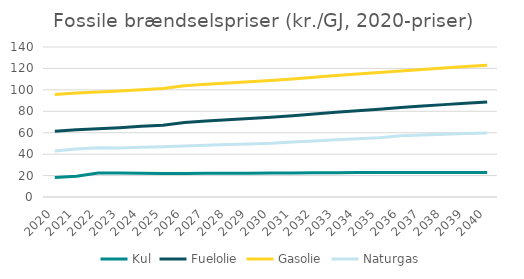
| Category | Kul | Fuelolie | Gasolie | Naturgas |
|---|---|---|---|---|
| 2020.0 | 18.234 | 61.315 | 95.565 | 43.001 |
| 2021.0 | 19.397 | 62.73 | 96.98 | 44.762 |
| 2022.0 | 22.372 | 63.641 | 97.891 | 45.987 |
| 2023.0 | 22.361 | 64.729 | 98.979 | 45.744 |
| 2024.0 | 22.127 | 65.955 | 100.205 | 46.349 |
| 2025.0 | 21.853 | 66.935 | 101.186 | 46.904 |
| 2026.0 | 21.973 | 69.586 | 103.836 | 47.589 |
| 2027.0 | 22.08 | 70.9 | 105.15 | 48.247 |
| 2028.0 | 22.182 | 72.159 | 106.41 | 48.895 |
| 2029.0 | 22.271 | 73.336 | 107.586 | 49.513 |
| 2030.0 | 22.358 | 74.479 | 108.729 | 50.132 |
| 2031.0 | 22.486 | 75.819 | 110.07 | 51.261 |
| 2032.0 | 22.606 | 77.516 | 111.767 | 52.358 |
| 2033.0 | 22.707 | 79.089 | 113.339 | 53.397 |
| 2034.0 | 22.802 | 80.588 | 114.838 | 54.408 |
| 2035.0 | 22.885 | 81.991 | 116.242 | 55.378 |
| 2036.0 | 22.904 | 83.43 | 117.68 | 57.193 |
| 2037.0 | 22.912 | 84.86 | 119.11 | 57.907 |
| 2038.0 | 22.915 | 86.218 | 120.469 | 58.584 |
| 2039.0 | 22.909 | 87.477 | 121.727 | 59.206 |
| 2040.0 | 22.9 | 88.678 | 122.928 | 59.799 |